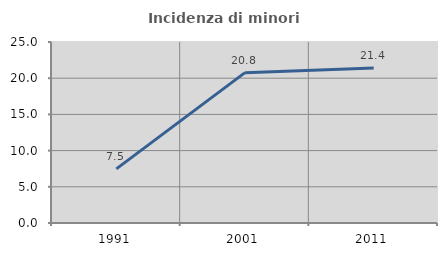
| Category | Incidenza di minori stranieri |
|---|---|
| 1991.0 | 7.477 |
| 2001.0 | 20.764 |
| 2011.0 | 21.399 |